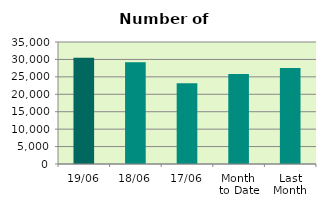
| Category | Series 0 |
|---|---|
| 19/06 | 30504 |
| 18/06 | 29164 |
| 17/06 | 23186 |
| Month 
to Date | 25800.769 |
| Last
Month | 27522.455 |